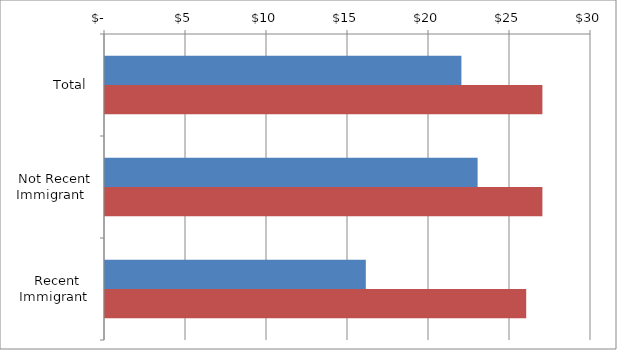
| Category | Series 0 | Series 1 |
|---|---|---|
| Total | 22 | 27 |
|  Not Recent Immigrant  | 23 | 27 |
|  Recent Immigrant  | 16.1 | 26 |